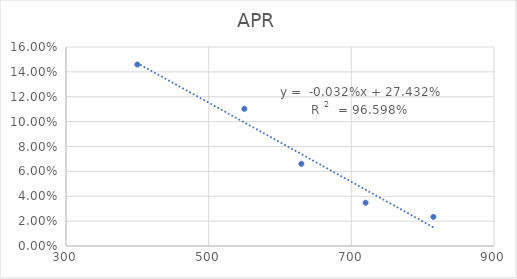
| Category | APR |
|---|---|
| 400.0 | 0.146 |
| 550.0 | 0.11 |
| 630.0 | 0.066 |
| 720.0 | 0.035 |
| 815.0 | 0.023 |